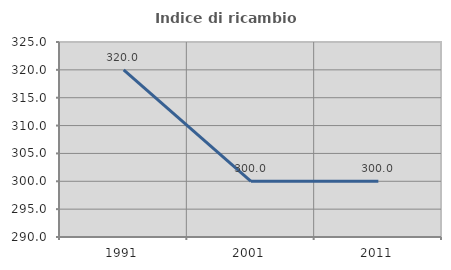
| Category | Indice di ricambio occupazionale  |
|---|---|
| 1991.0 | 320 |
| 2001.0 | 300 |
| 2011.0 | 300 |